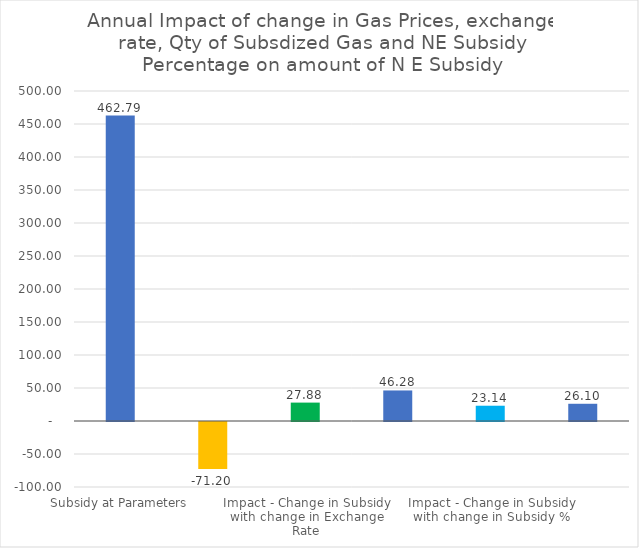
| Category | Series 0 |
|---|---|
| Subsidy at Parameters | 462.789 |
| Impact -Change in Subsidy with change in gas price | -71.198 |
| Impact - Change in Subsidy with change in Exchange Rate | 27.879 |
| Impact - Change in Subsidied Gas Qty | 46.279 |
| Impact - Change in Subsidy with change in Subsidy % | 23.139 |
| Combined Impact | 26.099 |